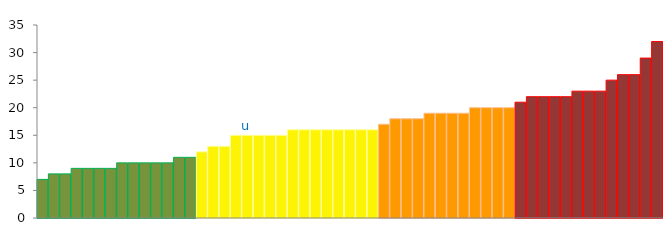
| Category | Top Quartile | 2nd Quartile | 3rd Quartile | Bottom Quartile | Series 4 |
|---|---|---|---|---|---|
|  | 7 | 0 | 0 | 0 | 7 |
|  | 8 | 0 | 0 | 0 | 8 |
|  | 8 | 0 | 0 | 0 | 8 |
|  | 9 | 0 | 0 | 0 | 9 |
|  | 9 | 0 | 0 | 0 | 9 |
|  | 9 | 0 | 0 | 0 | 9 |
|  | 9 | 0 | 0 | 0 | 9 |
|  | 10 | 0 | 0 | 0 | 10 |
|  | 10 | 0 | 0 | 0 | 10 |
|  | 10 | 0 | 0 | 0 | 10 |
|  | 10 | 0 | 0 | 0 | 10 |
|  | 10 | 0 | 0 | 0 | 10 |
|  | 11 | 0 | 0 | 0 | 11 |
|  | 11 | 0 | 0 | 0 | 11 |
|  | 0 | 12 | 0 | 0 | 12 |
|  | 0 | 13 | 0 | 0 | 13 |
|  | 0 | 13 | 0 | 0 | 13 |
|  | 0 | 15 | 0 | 0 | 15 |
| u | 0 | 15 | 0 | 0 | 15 |